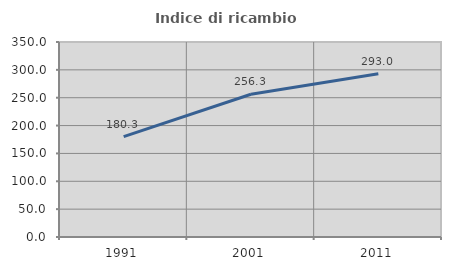
| Category | Indice di ricambio occupazionale  |
|---|---|
| 1991.0 | 180.276 |
| 2001.0 | 256.285 |
| 2011.0 | 293.025 |